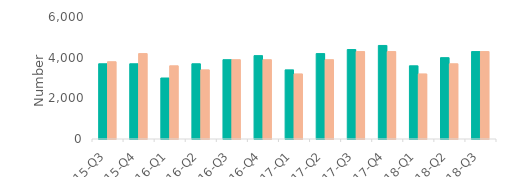
| Category | First-time
buyers | Home movers |
|---|---|---|
| 15-Q3 | 3700 | 3800 |
| 15-Q4 | 3700 | 4200 |
| 16-Q1 | 3000 | 3600 |
| 16-Q2 | 3700 | 3400 |
| 16-Q3 | 3900 | 3900 |
| 16-Q4 | 4100 | 3900 |
| 17-Q1 | 3400 | 3200 |
| 17-Q2 | 4200 | 3900 |
| 17-Q3 | 4400 | 4300 |
| 17-Q4 | 4600 | 4300 |
| 18-Q1 | 3600 | 3200 |
| 18-Q2 | 4000 | 3700 |
| 18-Q3 | 4300 | 4300 |